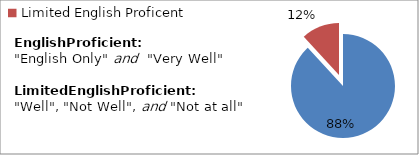
| Category | Percent |
|---|---|
| English Proficient | 0.882 |
| Limited English Proficent | 0.118 |